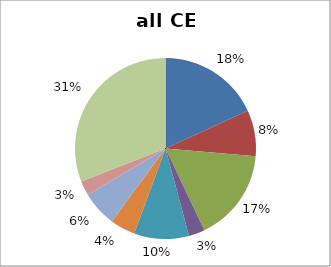
| Category | Series 0 |
|---|---|
| 0 | 215 |
| 1 | 97 |
| 2 | 196 |
| 3 | 34 |
| 4 | 116 |
| 5 | 53 |
| 6 | 75 |
| 7 | 31 |
| 8 | 366 |